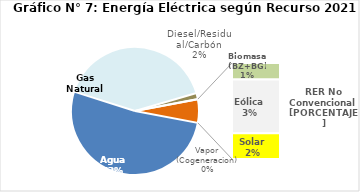
| Category | Series 0 |
|---|---|
| Agua | 2491.961 |
| Gas Natural | 1947.343 |
| Diesel/Residual/Carbón | 74.768 |
| Vapor (Cogeneracion) | 0.22 |
| Biomasa (BZ+BG) | 49.311 |
| Eólica | 159.688 |
| Solar | 76.366 |